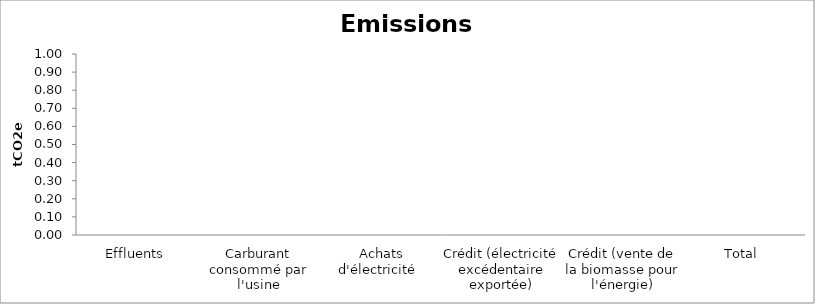
| Category | tCO2e |
|---|---|
| Effluents | 0 |
| Carburant consommé par l'usine | 0 |
|  Achats d'électricité  | 0 |
| Crédit (électricité excédentaire exportée) | 0 |
| Crédit (vente de la biomasse pour l'énergie) | 0 |
| Total  | 0 |